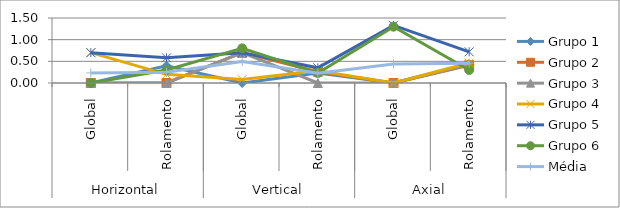
| Category | Grupo 1 | Grupo 2 | Grupo 3 | Grupo 4 | Grupo 5 | Grupo 6 | Média |
|---|---|---|---|---|---|---|---|
| 0 | 0 | 0 | 0 | 0.7 | 0.7 | 0 | 0.233 |
| 1 | 0.4 | 0 | 0 | 0.2 | 0.58 | 0.3 | 0.247 |
| 2 | 0 | 0.7 | 0.7 | 0.08 | 0.7 | 0.8 | 0.497 |
| 3 | 0.23 | 0.26 | 0 | 0.28 | 0.35 | 0.23 | 0.225 |
| 4 | 0 | 0 | 0 | 0 | 1.33 | 1.3 | 0.438 |
| 5 | 0.44 | 0.41 | 0.42 | 0.46 | 0.72 | 0.3 | 0.458 |